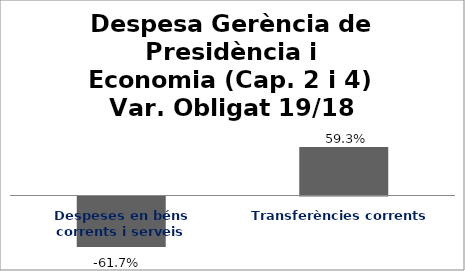
| Category | Series 0 |
|---|---|
| Despeses en béns corrents i serveis | -0.617 |
| Transferències corrents | 0.593 |